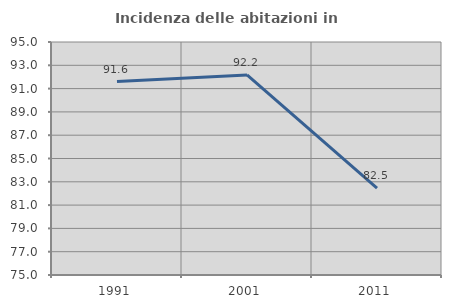
| Category | Incidenza delle abitazioni in proprietà  |
|---|---|
| 1991.0 | 91.608 |
| 2001.0 | 92.174 |
| 2011.0 | 82.456 |